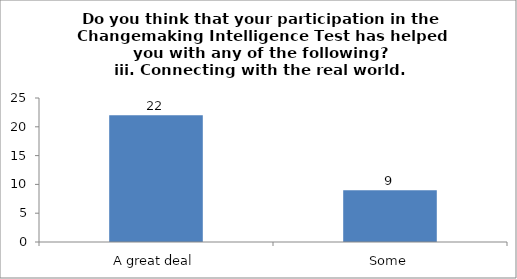
| Category | Do you think that your participation in the Changemaking Intelligence Test has helped you with any of the following?
iii. Connecting with the real world. |
|---|---|
| A great deal | 22 |
| Some | 9 |